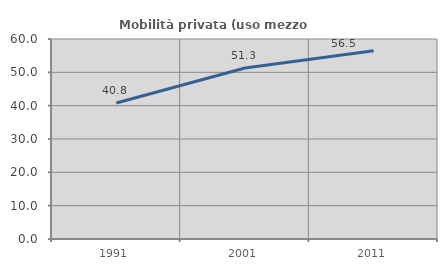
| Category | Mobilità privata (uso mezzo privato) |
|---|---|
| 1991.0 | 40.798 |
| 2001.0 | 51.292 |
| 2011.0 | 56.474 |